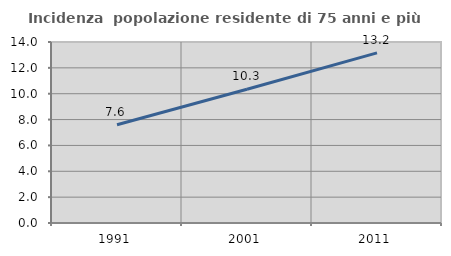
| Category | Incidenza  popolazione residente di 75 anni e più |
|---|---|
| 1991.0 | 7.597 |
| 2001.0 | 10.348 |
| 2011.0 | 13.16 |